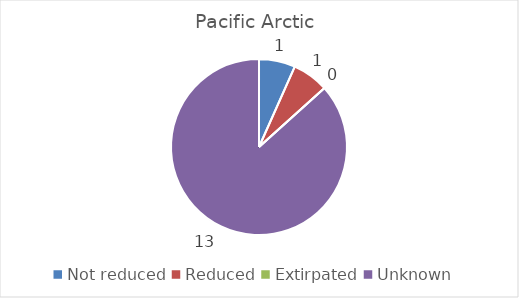
| Category | Pacific Arctic |
|---|---|
| Not reduced | 1 |
| Reduced | 1 |
| Extirpated | 0 |
| Unknown | 13 |